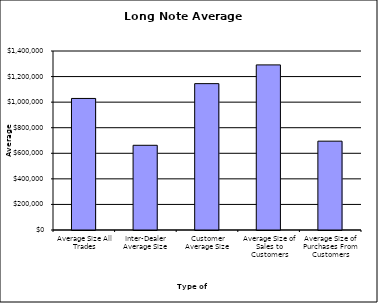
| Category | Security Type |
|---|---|
| Average Size All Trades | 1028979.784 |
| Inter-Dealer Average Size | 662597.428 |
| Customer Average Size | 1144824.959 |
| Average Size of Sales to Customers | 1291357.136 |
| Average Size of Purchases From Customers | 694864.123 |